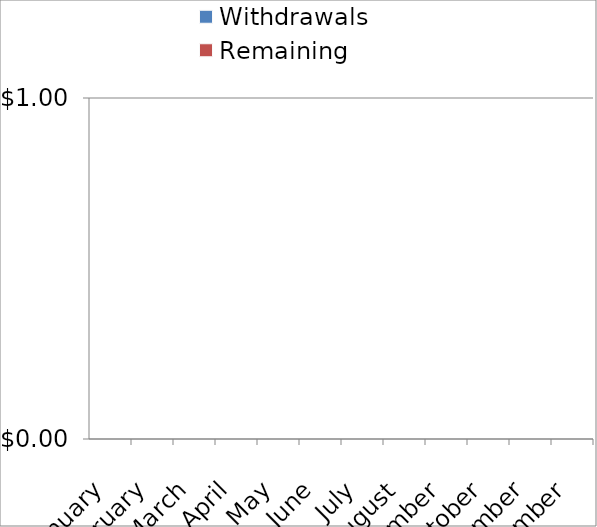
| Category | Withdrawals | Remaining |
|---|---|---|
| January |  | 0 |
| February |  | 0 |
| March |  | 0 |
| April |  | 0 |
| May |  | 0 |
| June |  | 0 |
| July |  | 0 |
| August |  | 0 |
| September |  | 0 |
| October |  | 0 |
| November |  | 0 |
| December |  | 0 |